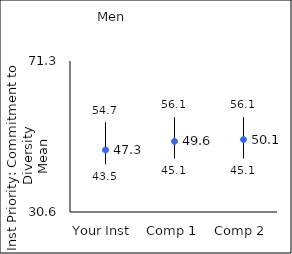
| Category | 25th percentile | 75th percentile | Mean |
|---|---|---|---|
| Your Inst | 43.5 | 54.7 | 47.32 |
| Comp 1 | 45.1 | 56.1 | 49.63 |
| Comp 2 | 45.1 | 56.1 | 50.12 |